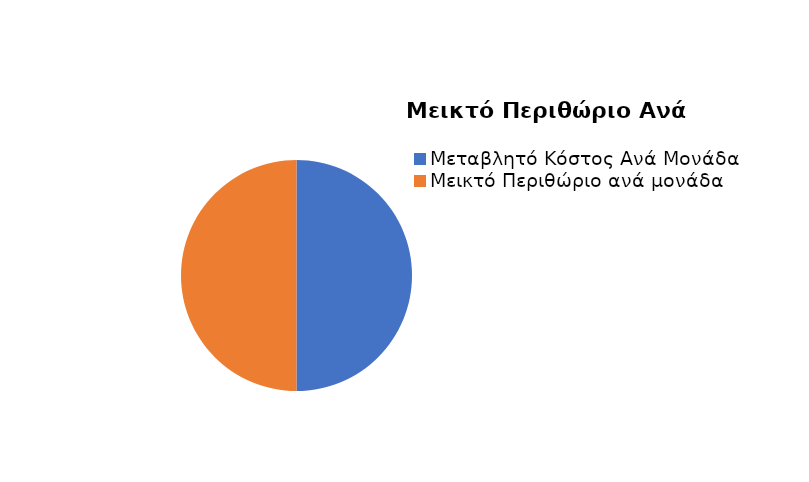
| Category | Series 0 |
|---|---|
| Μεταβλητό Κόστος Ανά Μονάδα | 5 |
| Μεικτό Περιθώριο ανά μονάδα | 5 |